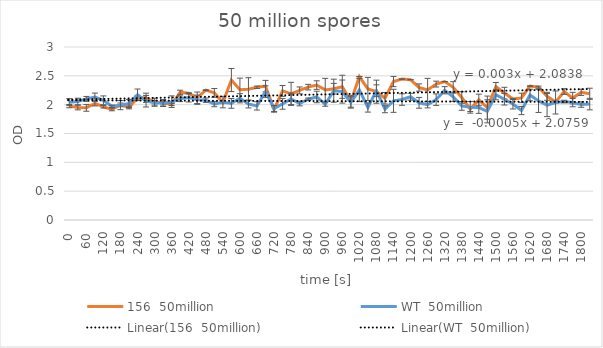
| Category | 156  50million | WT  50million |
|---|---|---|
| 0.0 | 1.975 | 2.044 |
| 30.0 | 1.95 | 2.055 |
| 60.0 | 1.945 | 2.1 |
| 90.0 | 2.022 | 2.13 |
| 120.0 | 1.964 | 2.075 |
| 150.0 | 1.918 | 1.971 |
| 180.0 | 1.997 | 1.992 |
| 210.0 | 1.952 | 2.02 |
| 240.0 | 2.121 | 2.171 |
| 270.0 | 2.119 | 2.06 |
| 300.0 | 2.042 | 2.033 |
| 330.0 | 2.037 | 2.028 |
| 360.0 | 2.002 | 2.052 |
| 390.0 | 2.212 | 2.102 |
| 420.0 | 2.197 | 2.122 |
| 450.0 | 2.119 | 2.086 |
| 480.0 | 2.251 | 2.078 |
| 510.0 | 2.204 | 2.01 |
| 540.0 | 2.035 | 2.045 |
| 570.0 | 2.427 | 2.022 |
| 600.0 | 2.26 | 2.111 |
| 630.0 | 2.268 | 2.012 |
| 660.0 | 2.302 | 1.979 |
| 690.0 | 2.321 | 2.226 |
| 720.0 | 1.917 | 1.934 |
| 750.0 | 2.238 | 2.013 |
| 780.0 | 2.187 | 2.1 |
| 810.0 | 2.248 | 2.02 |
| 840.0 | 2.304 | 2.094 |
| 870.0 | 2.34 | 2.134 |
| 900.0 | 2.256 | 2.008 |
| 930.0 | 2.277 | 2.242 |
| 960.0 | 2.31 | 2.227 |
| 990.0 | 2.056 | 2.039 |
| 1020.0 | 2.486 | 2.253 |
| 1050.0 | 2.273 | 1.951 |
| 1080.0 | 2.225 | 2.244 |
| 1110.0 | 2.111 | 1.921 |
| 1140.0 | 2.401 | 2.067 |
| 1170.0 | 2.443 | 2.089 |
| 1200.0 | 2.433 | 2.137 |
| 1230.0 | 2.297 | 2.032 |
| 1260.0 | 2.256 | 1.999 |
| 1290.0 | 2.357 | 2.087 |
| 1320.0 | 2.4 | 2.25 |
| 1350.0 | 2.3 | 2.137 |
| 1380.0 | 2.124 | 1.978 |
| 1410.0 | 1.924 | 1.953 |
| 1440.0 | 2.082 | 1.949 |
| 1470.0 | 1.949 | 1.885 |
| 1500.0 | 2.311 | 2.172 |
| 1530.0 | 2.201 | 2.094 |
| 1560.0 | 2.097 | 2.012 |
| 1590.0 | 2.117 | 1.898 |
| 1620.0 | 2.322 | 2.168 |
| 1650.0 | 2.304 | 2.065 |
| 1680.0 | 2.145 | 1.993 |
| 1710.0 | 2.045 | 2.038 |
| 1740.0 | 2.228 | 2.054 |
| 1770.0 | 2.114 | 2.036 |
| 1800.0 | 2.214 | 2.002 |
| 1830.0 | 2.189 | 2.01 |